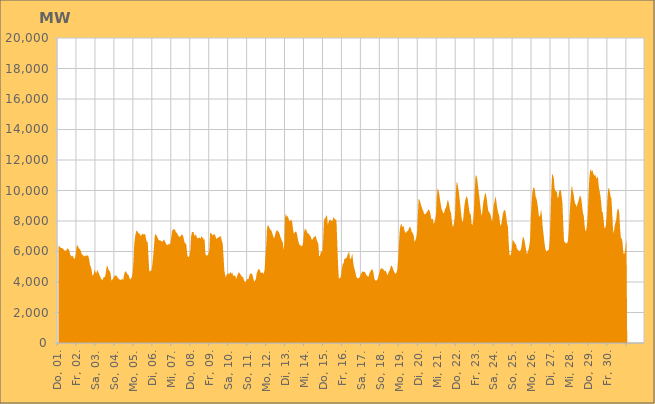
| Category | Series 0 |
|---|---|
|  Do, 01.  | 6313.127 |
|  Do, 01.  | 6357.476 |
|  Do, 01.  | 6304.096 |
|  Do, 01.  | 6225.178 |
|  Do, 01.  | 6220.954 |
|  Do, 01.  | 6224.475 |
|  Do, 01.  | 6151.611 |
|  Do, 01.  | 6129.18 |
|  Do, 01.  | 6037.008 |
|  Do, 01.  | 6063.969 |
|  Do, 01.  | 6048.429 |
|  Do, 01.  | 6220.16 |
|  Do, 01.  | 6166.886 |
|  Do, 01.  | 6145.01 |
|  Do, 01.  | 6027.437 |
|  Do, 01.  | 5776.582 |
|  Do, 01.  | 5723.07 |
|  Fr, 02.  | 5669.2 |
|  Fr, 02.  | 5717.688 |
|  Fr, 02.  | 5616.907 |
|  Fr, 02.  | 5516.828 |
|  Fr, 02.  | 5552.081 |
|  Fr, 02.  | 5806.998 |
|  Fr, 02.  | 6319.606 |
|  Fr, 02.  | 6419.245 |
|  Fr, 02.  | 6318.295 |
|  Fr, 02.  | 6203.759 |
|  Fr, 02.  | 6161.594 |
|  Fr, 02.  | 6093.851 |
|  Fr, 02.  | 5925.767 |
|  Fr, 02.  | 5749.143 |
|  Fr, 02.  | 5816.829 |
|  Fr, 02.  | 5699.738 |
|  Fr, 02.  | 5676.35 |
|  Fr, 02.  | 5717.721 |
|  Fr, 02.  | 5767.764 |
|  Fr, 02.  | 5703.202 |
|  Fr, 02.  | 5749.007 |
|  Fr, 02.  | 5691.561 |
|  Fr, 02.  | 5461.218 |
|  Fr, 02.  | 5111.09 |
|  Sa, 03.  | 5003.085 |
|  Sa, 03.  | 4805.781 |
|  Sa, 03.  | 4424.343 |
|  Sa, 03.  | 4453.459 |
|  Sa, 03.  | 4580.996 |
|  Sa, 03.  | 4837.286 |
|  Sa, 03.  | 4644.824 |
|  Sa, 03.  | 4557.166 |
|  Sa, 03.  | 4787.403 |
|  Sa, 03.  | 4703.969 |
|  Sa, 03.  | 4605.649 |
|  Sa, 03.  | 4450.893 |
|  Sa, 03.  | 4343.789 |
|  Sa, 03.  | 4198.409 |
|  Sa, 03.  | 4162.436 |
|  Sa, 03.  | 4142.401 |
|  Sa, 03.  | 4288.369 |
|  Sa, 03.  | 4323.473 |
|  Sa, 03.  | 4337.465 |
|  Sa, 03.  | 4575.455 |
|  Sa, 03.  | 5003.796 |
|  Sa, 03.  | 5060.668 |
|  Sa, 03.  | 4885.128 |
|  Sa, 03.  | 4746.077 |
|  So, 04.  | 4711.686 |
|  So, 04.  | 4575.496 |
|  So, 04.  | 4092.764 |
|  So, 04.  | 4158.17 |
|  So, 04.  | 4184.512 |
|  So, 04.  | 4307.864 |
|  So, 04.  | 4408.029 |
|  So, 04.  | 4425.54 |
|  So, 04.  | 4421.575 |
|  So, 04.  | 4386.333 |
|  So, 04.  | 4299.27 |
|  So, 04.  | 4227.672 |
|  So, 04.  | 4166.239 |
|  So, 04.  | 4155.13 |
|  So, 04.  | 4118.833 |
|  So, 04.  | 4173.161 |
|  So, 04.  | 4227.237 |
|  So, 04.  | 4099.282 |
|  So, 04.  | 4440.94 |
|  So, 04.  | 4639.087 |
|  So, 04.  | 4703.274 |
|  So, 04.  | 4655.949 |
|  So, 04.  | 4528.27 |
|  So, 04.  | 4486.357 |
|  Mo, 05.  | 4433.787 |
|  Mo, 05.  | 4241.841 |
|  Mo, 05.  | 4167.412 |
|  Mo, 05.  | 4239.905 |
|  Mo, 05.  | 4326.349 |
|  Mo, 05.  | 4640.568 |
|  Mo, 05.  | 5300.942 |
|  Mo, 05.  | 6488.641 |
|  Mo, 05.  | 6940.175 |
|  Mo, 05.  | 7241.371 |
|  Mo, 05.  | 7386.085 |
|  Mo, 05.  | 7327.374 |
|  Mo, 05.  | 7206.397 |
|  Mo, 05.  | 7181.904 |
|  Mo, 05.  | 7166.263 |
|  Mo, 05.  | 7021.53 |
|  Mo, 05.  | 7058.829 |
|  Mo, 05.  | 7152.25 |
|  Mo, 05.  | 7170.063 |
|  Mo, 05.  | 7095.858 |
|  Mo, 05.  | 7149.625 |
|  Mo, 05.  | 7106.2 |
|  Mo, 05.  | 6809.292 |
|  Mo, 05.  | 6620.216 |
|  Di, 06.  | 6630.77 |
|  Di, 06.  | 5673.465 |
|  Di, 06.  | 4703.25 |
|  Di, 06.  | 4703.381 |
|  Di, 06.  | 4749.246 |
|  Di, 06.  | 4806.052 |
|  Di, 06.  | 5182.665 |
|  Di, 06.  | 5678.105 |
|  Di, 06.  | 6341.361 |
|  Di, 06.  | 7026.9 |
|  Di, 06.  | 7154.887 |
|  Di, 06.  | 7064.166 |
|  Di, 06.  | 6958.48 |
|  Di, 06.  | 6863.517 |
|  Di, 06.  | 6739.085 |
|  Di, 06.  | 6724.219 |
|  Di, 06.  | 6751.517 |
|  Di, 06.  | 6652.256 |
|  Di, 06.  | 6698.971 |
|  Di, 06.  | 6631.317 |
|  Di, 06.  | 6783.258 |
|  Di, 06.  | 6759.547 |
|  Di, 06.  | 6641.529 |
|  Di, 06.  | 6546.107 |
|  Mi, 07.  | 6435.412 |
|  Mi, 07.  | 6427.219 |
|  Mi, 07.  | 6445.172 |
|  Mi, 07.  | 6538.629 |
|  Mi, 07.  | 6442.497 |
|  Mi, 07.  | 6596.366 |
|  Mi, 07.  | 6995.698 |
|  Mi, 07.  | 7336.717 |
|  Mi, 07.  | 7456.373 |
|  Mi, 07.  | 7432.278 |
|  Mi, 07.  | 7473.742 |
|  Mi, 07.  | 7362.355 |
|  Mi, 07.  | 7251.961 |
|  Mi, 07.  | 7222.587 |
|  Mi, 07.  | 7117.114 |
|  Mi, 07.  | 7018.814 |
|  Mi, 07.  | 6956.25 |
|  Mi, 07.  | 6995.223 |
|  Mi, 07.  | 7003.775 |
|  Mi, 07.  | 7116.561 |
|  Mi, 07.  | 7087.588 |
|  Mi, 07.  | 7005.832 |
|  Mi, 07.  | 6748.885 |
|  Mi, 07.  | 6560.87 |
|  Do, 08.  | 6534.617 |
|  Do, 08.  | 6449.463 |
|  Do, 08.  | 5844.643 |
|  Do, 08.  | 5630.972 |
|  Do, 08.  | 5657.708 |
|  Do, 08.  | 5741.593 |
|  Do, 08.  | 6057.375 |
|  Do, 08.  | 6983.519 |
|  Do, 08.  | 7270.562 |
|  Do, 08.  | 7284.493 |
|  Do, 08.  | 7286.513 |
|  Do, 08.  | 7049.177 |
|  Do, 08.  | 7034.208 |
|  Do, 08.  | 7140.975 |
|  Do, 08.  | 6951.699 |
|  Do, 08.  | 6875.016 |
|  Do, 08.  | 6863.421 |
|  Do, 08.  | 6897.326 |
|  Do, 08.  | 6923.452 |
|  Do, 08.  | 6834.187 |
|  Do, 08.  | 7027.12 |
|  Do, 08.  | 6873.91 |
|  Do, 08.  | 6947.371 |
|  Do, 08.  | 6761.389 |
|  Fr, 09.  | 6834.662 |
|  Fr, 09.  | 5869.232 |
|  Fr, 09.  | 5748.545 |
|  Fr, 09.  | 5734.458 |
|  Fr, 09.  | 5767.678 |
|  Fr, 09.  | 5872.889 |
|  Fr, 09.  | 6111.792 |
|  Fr, 09.  | 7173.131 |
|  Fr, 09.  | 7229.423 |
|  Fr, 09.  | 7149.998 |
|  Fr, 09.  | 7057.953 |
|  Fr, 09.  | 7082.757 |
|  Fr, 09.  | 7159.592 |
|  Fr, 09.  | 7082.738 |
|  Fr, 09.  | 6978.186 |
|  Fr, 09.  | 6821.046 |
|  Fr, 09.  | 6883.567 |
|  Fr, 09.  | 6882.887 |
|  Fr, 09.  | 6955.09 |
|  Fr, 09.  | 6969.848 |
|  Fr, 09.  | 7019.275 |
|  Fr, 09.  | 6902.404 |
|  Fr, 09.  | 6677.527 |
|  Fr, 09.  | 6525.449 |
|  Sa, 10.  | 5685.53 |
|  Sa, 10.  | 4789.417 |
|  Sa, 10.  | 4465.608 |
|  Sa, 10.  | 4296.912 |
|  Sa, 10.  | 4486.746 |
|  Sa, 10.  | 4534.058 |
|  Sa, 10.  | 4581.499 |
|  Sa, 10.  | 4498.341 |
|  Sa, 10.  | 4607.307 |
|  Sa, 10.  | 4658.383 |
|  Sa, 10.  | 4535.82 |
|  Sa, 10.  | 4610.371 |
|  Sa, 10.  | 4479.933 |
|  Sa, 10.  | 4377.301 |
|  Sa, 10.  | 4431.904 |
|  Sa, 10.  | 4417.656 |
|  Sa, 10.  | 4186.069 |
|  Sa, 10.  | 4339.454 |
|  Sa, 10.  | 4490.166 |
|  Sa, 10.  | 4603.758 |
|  Sa, 10.  | 4639.287 |
|  Sa, 10.  | 4532.868 |
|  Sa, 10.  | 4445.97 |
|  Sa, 10.  | 4385.733 |
|  So, 11.  | 4315.727 |
|  So, 11.  | 4301.465 |
|  So, 11.  | 4077.419 |
|  So, 11.  | 4048.475 |
|  So, 11.  | 3942.382 |
|  So, 11.  | 4122.074 |
|  So, 11.  | 4203.681 |
|  So, 11.  | 4172.451 |
|  So, 11.  | 4242.063 |
|  So, 11.  | 4475.376 |
|  So, 11.  | 4551.462 |
|  So, 11.  | 4551.041 |
|  So, 11.  | 4532.359 |
|  So, 11.  | 4404.868 |
|  So, 11.  | 4163.997 |
|  So, 11.  | 4008.391 |
|  So, 11.  | 4120.289 |
|  So, 11.  | 4201.225 |
|  So, 11.  | 4553.065 |
|  So, 11.  | 4703.255 |
|  So, 11.  | 4817.548 |
|  So, 11.  | 4855.379 |
|  So, 11.  | 4776.482 |
|  So, 11.  | 4613.032 |
|  Mo, 12.  | 4584.554 |
|  Mo, 12.  | 4626.382 |
|  Mo, 12.  | 4596.664 |
|  Mo, 12.  | 4516.47 |
|  Mo, 12.  | 4802.343 |
|  Mo, 12.  | 5651.422 |
|  Mo, 12.  | 6328.447 |
|  Mo, 12.  | 7508.529 |
|  Mo, 12.  | 7719.061 |
|  Mo, 12.  | 7695.031 |
|  Mo, 12.  | 7565.394 |
|  Mo, 12.  | 7439.666 |
|  Mo, 12.  | 7412.619 |
|  Mo, 12.  | 7321.371 |
|  Mo, 12.  | 7151.131 |
|  Mo, 12.  | 6976.116 |
|  Mo, 12.  | 6861.968 |
|  Mo, 12.  | 7010.028 |
|  Mo, 12.  | 7238.367 |
|  Mo, 12.  | 7371.648 |
|  Mo, 12.  | 7392.358 |
|  Mo, 12.  | 7337.577 |
|  Mo, 12.  | 7264.457 |
|  Mo, 12.  | 7151.221 |
|  Di, 13.  | 6958.164 |
|  Di, 13.  | 6846.768 |
|  Di, 13.  | 6683.756 |
|  Di, 13.  | 6636.052 |
|  Di, 13.  | 6090.101 |
|  Di, 13.  | 6573.839 |
|  Di, 13.  | 8223.191 |
|  Di, 13.  | 8484.046 |
|  Di, 13.  | 8289.314 |
|  Di, 13.  | 8333.405 |
|  Di, 13.  | 8205.31 |
|  Di, 13.  | 8069.634 |
|  Di, 13.  | 7965.405 |
|  Di, 13.  | 8050.052 |
|  Di, 13.  | 8079.441 |
|  Di, 13.  | 7910.421 |
|  Di, 13.  | 7455.946 |
|  Di, 13.  | 7163.39 |
|  Di, 13.  | 7244.739 |
|  Di, 13.  | 7301.319 |
|  Di, 13.  | 7314.878 |
|  Di, 13.  | 7153.391 |
|  Di, 13.  | 6843.459 |
|  Di, 13.  | 6614.938 |
|  Mi, 14.  | 6454.183 |
|  Mi, 14.  | 6430.111 |
|  Mi, 14.  | 6342.385 |
|  Mi, 14.  | 6369.514 |
|  Mi, 14.  | 6387.761 |
|  Mi, 14.  | 6714.389 |
|  Mi, 14.  | 7252.609 |
|  Mi, 14.  | 7511.298 |
|  Mi, 14.  | 7430.516 |
|  Mi, 14.  | 7394.299 |
|  Mi, 14.  | 7216.941 |
|  Mi, 14.  | 7194.032 |
|  Mi, 14.  | 7147.29 |
|  Mi, 14.  | 7065.21 |
|  Mi, 14.  | 7018.079 |
|  Mi, 14.  | 6869.069 |
|  Mi, 14.  | 6745.471 |
|  Mi, 14.  | 6831.293 |
|  Mi, 14.  | 6916.863 |
|  Mi, 14.  | 6955.699 |
|  Mi, 14.  | 7032.082 |
|  Mi, 14.  | 6967.101 |
|  Mi, 14.  | 6761.559 |
|  Mi, 14.  | 6622.143 |
|  Do, 15.  | 6507.213 |
|  Do, 15.  | 5719.595 |
|  Do, 15.  | 5687.7 |
|  Do, 15.  | 5917.539 |
|  Do, 15.  | 6007.761 |
|  Do, 15.  | 5977.291 |
|  Do, 15.  | 6570.924 |
|  Do, 15.  | 7984.334 |
|  Do, 15.  | 8166.61 |
|  Do, 15.  | 8185.404 |
|  Do, 15.  | 8330.044 |
|  Do, 15.  | 8383.462 |
|  Do, 15.  | 7730.397 |
|  Do, 15.  | 7930.203 |
|  Do, 15.  | 8044.552 |
|  Do, 15.  | 8104.255 |
|  Do, 15.  | 8042.369 |
|  Do, 15.  | 8005.308 |
|  Do, 15.  | 8001.382 |
|  Do, 15.  | 8262.389 |
|  Do, 15.  | 8177.813 |
|  Do, 15.  | 8122.19 |
|  Do, 15.  | 8072.43 |
|  Do, 15.  | 8016.69 |
|  Fr, 16.  | 6486.733 |
|  Fr, 16.  | 5127.311 |
|  Fr, 16.  | 4224.83 |
|  Fr, 16.  | 4260.872 |
|  Fr, 16.  | 4288.041 |
|  Fr, 16.  | 4518.249 |
|  Fr, 16.  | 4907.443 |
|  Fr, 16.  | 5189.74 |
|  Fr, 16.  | 5232.799 |
|  Fr, 16.  | 5510.299 |
|  Fr, 16.  | 5540.102 |
|  Fr, 16.  | 5559.193 |
|  Fr, 16.  | 5594.735 |
|  Fr, 16.  | 5797.239 |
|  Fr, 16.  | 5883.084 |
|  Fr, 16.  | 6019.737 |
|  Fr, 16.  | 5573.435 |
|  Fr, 16.  | 5477.059 |
|  Fr, 16.  | 5643.973 |
|  Fr, 16.  | 5881.516 |
|  Fr, 16.  | 5356.726 |
|  Fr, 16.  | 5010.366 |
|  Fr, 16.  | 4832.012 |
|  Fr, 16.  | 4610.285 |
|  Sa, 17.  | 4373.749 |
|  Sa, 17.  | 4265.926 |
|  Sa, 17.  | 4235.174 |
|  Sa, 17.  | 4248.568 |
|  Sa, 17.  | 4290.584 |
|  Sa, 17.  | 4381.995 |
|  Sa, 17.  | 4538.223 |
|  Sa, 17.  | 4608.795 |
|  Sa, 17.  | 4704.103 |
|  Sa, 17.  | 4674.569 |
|  Sa, 17.  | 4666.676 |
|  Sa, 17.  | 4653.055 |
|  Sa, 17.  | 4547.321 |
|  Sa, 17.  | 4435.919 |
|  Sa, 17.  | 4405.114 |
|  Sa, 17.  | 4328.903 |
|  Sa, 17.  | 4421.965 |
|  Sa, 17.  | 4605.425 |
|  Sa, 17.  | 4703.136 |
|  Sa, 17.  | 4809.62 |
|  Sa, 17.  | 4816.209 |
|  Sa, 17.  | 4775.699 |
|  Sa, 17.  | 4535.335 |
|  Sa, 17.  | 4217.811 |
|  So, 18.  | 4111.855 |
|  So, 18.  | 4098.547 |
|  So, 18.  | 4110.141 |
|  So, 18.  | 4201.806 |
|  So, 18.  | 4366.338 |
|  So, 18.  | 4598.451 |
|  So, 18.  | 4754.27 |
|  So, 18.  | 4867.352 |
|  So, 18.  | 4912.06 |
|  So, 18.  | 4884.929 |
|  So, 18.  | 4840.465 |
|  So, 18.  | 4787.917 |
|  So, 18.  | 4702.423 |
|  So, 18.  | 4742.207 |
|  So, 18.  | 4664.022 |
|  So, 18.  | 4502.346 |
|  So, 18.  | 4460.955 |
|  So, 18.  | 4659.02 |
|  So, 18.  | 4722.269 |
|  So, 18.  | 4891.623 |
|  So, 18.  | 5078.538 |
|  So, 18.  | 5067.953 |
|  So, 18.  | 4948.451 |
|  So, 18.  | 4783.107 |
|  Mo, 19.  | 4667.928 |
|  Mo, 19.  | 4583.988 |
|  Mo, 19.  | 4529.573 |
|  Mo, 19.  | 4619.144 |
|  Mo, 19.  | 4822.228 |
|  Mo, 19.  | 5442.558 |
|  Mo, 19.  | 6450.341 |
|  Mo, 19.  | 7374.882 |
|  Mo, 19.  | 7700.589 |
|  Mo, 19.  | 7836.127 |
|  Mo, 19.  | 7674.049 |
|  Mo, 19.  | 7593.337 |
|  Mo, 19.  | 7688.953 |
|  Mo, 19.  | 7362.337 |
|  Mo, 19.  | 7262.359 |
|  Mo, 19.  | 7209.567 |
|  Mo, 19.  | 7342.378 |
|  Mo, 19.  | 7323.844 |
|  Mo, 19.  | 7403.657 |
|  Mo, 19.  | 7579.333 |
|  Mo, 19.  | 7594.03 |
|  Mo, 19.  | 7548.22 |
|  Mo, 19.  | 7324.525 |
|  Mo, 19.  | 7255.95 |
|  Di, 20.  | 7150.801 |
|  Di, 20.  | 6989.844 |
|  Di, 20.  | 6600.833 |
|  Di, 20.  | 6760.599 |
|  Di, 20.  | 6920.247 |
|  Di, 20.  | 7299.23 |
|  Di, 20.  | 8454.474 |
|  Di, 20.  | 9455.966 |
|  Di, 20.  | 9385.334 |
|  Di, 20.  | 9247.347 |
|  Di, 20.  | 9041.933 |
|  Di, 20.  | 8878.111 |
|  Di, 20.  | 8748.923 |
|  Di, 20.  | 8640.475 |
|  Di, 20.  | 8427.279 |
|  Di, 20.  | 8469.557 |
|  Di, 20.  | 8454.791 |
|  Di, 20.  | 8555.398 |
|  Di, 20.  | 8624.919 |
|  Di, 20.  | 8723.568 |
|  Di, 20.  | 8763.218 |
|  Di, 20.  | 8635.448 |
|  Di, 20.  | 8435.374 |
|  Di, 20.  | 8113.006 |
|  Mi, 21.  | 8107.764 |
|  Mi, 21.  | 8151.206 |
|  Mi, 21.  | 7813.419 |
|  Mi, 21.  | 7892.748 |
|  Mi, 21.  | 8136.37 |
|  Mi, 21.  | 8428.81 |
|  Mi, 21.  | 9574.07 |
|  Mi, 21.  | 10134.329 |
|  Mi, 21.  | 10025.493 |
|  Mi, 21.  | 9801.416 |
|  Mi, 21.  | 9412.528 |
|  Mi, 21.  | 9095.331 |
|  Mi, 21.  | 8785.278 |
|  Mi, 21.  | 8668.107 |
|  Mi, 21.  | 8544.56 |
|  Mi, 21.  | 8480.412 |
|  Mi, 21.  | 8712.571 |
|  Mi, 21.  | 8834.788 |
|  Mi, 21.  | 8948.587 |
|  Mi, 21.  | 9211.98 |
|  Mi, 21.  | 9394.109 |
|  Mi, 21.  | 9212.962 |
|  Mi, 21.  | 8961.907 |
|  Mi, 21.  | 8630.471 |
|  Do, 22.  | 8539.428 |
|  Do, 22.  | 8011.825 |
|  Do, 22.  | 7629.587 |
|  Do, 22.  | 7690.858 |
|  Do, 22.  | 7944.296 |
|  Do, 22.  | 8404.453 |
|  Do, 22.  | 9829.054 |
|  Do, 22.  | 10527.471 |
|  Do, 22.  | 10506.363 |
|  Do, 22.  | 10183.095 |
|  Do, 22.  | 9842.359 |
|  Do, 22.  | 9378.082 |
|  Do, 22.  | 8875.55 |
|  Do, 22.  | 8350.339 |
|  Do, 22.  | 8007.53 |
|  Do, 22.  | 7916.204 |
|  Do, 22.  | 8462.571 |
|  Do, 22.  | 9042.808 |
|  Do, 22.  | 9346.362 |
|  Do, 22.  | 9546.983 |
|  Do, 22.  | 9624.818 |
|  Do, 22.  | 9447.627 |
|  Do, 22.  | 9071.288 |
|  Do, 22.  | 8679.477 |
|  Fr, 23.  | 8463.835 |
|  Fr, 23.  | 8437.223 |
|  Fr, 23.  | 7798.222 |
|  Fr, 23.  | 7739.685 |
|  Fr, 23.  | 8044.934 |
|  Fr, 23.  | 8754.466 |
|  Fr, 23.  | 9984.997 |
|  Fr, 23.  | 10969.919 |
|  Fr, 23.  | 10983.989 |
|  Fr, 23.  | 10791.097 |
|  Fr, 23.  | 10347.504 |
|  Fr, 23.  | 9903.987 |
|  Fr, 23.  | 9500.706 |
|  Fr, 23.  | 9019.495 |
|  Fr, 23.  | 8547.028 |
|  Fr, 23.  | 8339.285 |
|  Fr, 23.  | 8816.97 |
|  Fr, 23.  | 9317.087 |
|  Fr, 23.  | 9523.773 |
|  Fr, 23.  | 9809.071 |
|  Fr, 23.  | 9820.883 |
|  Fr, 23.  | 9506.727 |
|  Fr, 23.  | 9081.132 |
|  Fr, 23.  | 8691.768 |
|  Sa, 24.  | 8601.996 |
|  Sa, 24.  | 8500.332 |
|  Sa, 24.  | 8421.765 |
|  Sa, 24.  | 8153.784 |
|  Sa, 24.  | 7979.423 |
|  Sa, 24.  | 8402.838 |
|  Sa, 24.  | 9082.651 |
|  Sa, 24.  | 9236.001 |
|  Sa, 24.  | 9639.155 |
|  Sa, 24.  | 9402.595 |
|  Sa, 24.  | 9021.338 |
|  Sa, 24.  | 8706.421 |
|  Sa, 24.  | 8489.769 |
|  Sa, 24.  | 8331.897 |
|  Sa, 24.  | 7836.761 |
|  Sa, 24.  | 7660.698 |
|  Sa, 24.  | 7896.079 |
|  Sa, 24.  | 8265.204 |
|  Sa, 24.  | 8552.966 |
|  Sa, 24.  | 8700.088 |
|  Sa, 24.  | 8726.928 |
|  Sa, 24.  | 8607.297 |
|  Sa, 24.  | 8214.73 |
|  Sa, 24.  | 7810.742 |
|  So, 25.  | 7640.415 |
|  So, 25.  | 6551.565 |
|  So, 25.  | 5747.373 |
|  So, 25.  | 5749.387 |
|  So, 25.  | 5842.889 |
|  So, 25.  | 6265.478 |
|  So, 25.  | 6785.403 |
|  So, 25.  | 6698.477 |
|  So, 25.  | 6629.487 |
|  So, 25.  | 6499.897 |
|  So, 25.  | 6488.566 |
|  So, 25.  | 6287.343 |
|  So, 25.  | 6128.708 |
|  So, 25.  | 6100.879 |
|  So, 25.  | 6031.812 |
|  So, 25.  | 6012.315 |
|  So, 25.  | 6082.442 |
|  So, 25.  | 6265.741 |
|  So, 25.  | 6672.641 |
|  So, 25.  | 6954.087 |
|  So, 25.  | 6913.559 |
|  So, 25.  | 6712.195 |
|  So, 25.  | 6388.786 |
|  So, 25.  | 6111.451 |
|  Mo, 26.  | 5833.893 |
|  Mo, 26.  | 5954.423 |
|  Mo, 26.  | 6115.728 |
|  Mo, 26.  | 6373.725 |
|  Mo, 26.  | 6731.7 |
|  Mo, 26.  | 8229.348 |
|  Mo, 26.  | 9229.218 |
|  Mo, 26.  | 9896.125 |
|  Mo, 26.  | 10141.585 |
|  Mo, 26.  | 10219.428 |
|  Mo, 26.  | 10066.471 |
|  Mo, 26.  | 9615.306 |
|  Mo, 26.  | 9482.347 |
|  Mo, 26.  | 9240.511 |
|  Mo, 26.  | 8900.029 |
|  Mo, 26.  | 8384.548 |
|  Mo, 26.  | 8262.033 |
|  Mo, 26.  | 8425.418 |
|  Mo, 26.  | 8749.651 |
|  Mo, 26.  | 8341.136 |
|  Mo, 26.  | 7614.354 |
|  Mo, 26.  | 7178.365 |
|  Mo, 26.  | 6691.44 |
|  Mo, 26.  | 6287.323 |
|  Di, 27.  | 6077.888 |
|  Di, 27.  | 6002.292 |
|  Di, 27.  | 6063.801 |
|  Di, 27.  | 6076.24 |
|  Di, 27.  | 6201.131 |
|  Di, 27.  | 6830.249 |
|  Di, 27.  | 8425.601 |
|  Di, 27.  | 10092.063 |
|  Di, 27.  | 11116.826 |
|  Di, 27.  | 10990.309 |
|  Di, 27.  | 10834.249 |
|  Di, 27.  | 10162.123 |
|  Di, 27.  | 9988.228 |
|  Di, 27.  | 9936.559 |
|  Di, 27.  | 9906.67 |
|  Di, 27.  | 9478.983 |
|  Di, 27.  | 9596.934 |
|  Di, 27.  | 9969.572 |
|  Di, 27.  | 10037.998 |
|  Di, 27.  | 10011.948 |
|  Di, 27.  | 9628.692 |
|  Di, 27.  | 9182.513 |
|  Di, 27.  | 7857.999 |
|  Di, 27.  | 6689.873 |
|  Mi, 28.  | 6616.708 |
|  Mi, 28.  | 6537.269 |
|  Mi, 28.  | 6544.325 |
|  Mi, 28.  | 6555.359 |
|  Mi, 28.  | 6726.106 |
|  Mi, 28.  | 7331.575 |
|  Mi, 28.  | 8368.648 |
|  Mi, 28.  | 9172.918 |
|  Mi, 28.  | 10010.674 |
|  Mi, 28.  | 10347.268 |
|  Mi, 28.  | 9986.528 |
|  Mi, 28.  | 9810.828 |
|  Mi, 28.  | 9402.336 |
|  Mi, 28.  | 9153.626 |
|  Mi, 28.  | 9069.314 |
|  Mi, 28.  | 8912.875 |
|  Mi, 28.  | 9124.019 |
|  Mi, 28.  | 9250.388 |
|  Mi, 28.  | 9472.429 |
|  Mi, 28.  | 9641.981 |
|  Mi, 28.  | 9629.605 |
|  Mi, 28.  | 9390.98 |
|  Mi, 28.  | 8926.98 |
|  Mi, 28.  | 8504.812 |
|  Do, 29.  | 8353.966 |
|  Do, 29.  | 7751.977 |
|  Do, 29.  | 7350.166 |
|  Do, 29.  | 7373.299 |
|  Do, 29.  | 7737.55 |
|  Do, 29.  | 8383.348 |
|  Do, 29.  | 9684.227 |
|  Do, 29.  | 10788.983 |
|  Do, 29.  | 11277.015 |
|  Do, 29.  | 11404.632 |
|  Do, 29.  | 11214.959 |
|  Do, 29.  | 11363.064 |
|  Do, 29.  | 11084.294 |
|  Do, 29.  | 11029.28 |
|  Do, 29.  | 10971.367 |
|  Do, 29.  | 11001.342 |
|  Do, 29.  | 10746.268 |
|  Do, 29.  | 10902.734 |
|  Do, 29.  | 10836.957 |
|  Do, 29.  | 10274.453 |
|  Do, 29.  | 9963.926 |
|  Do, 29.  | 9688.575 |
|  Do, 29.  | 9232.78 |
|  Do, 29.  | 8622.347 |
|  Fr, 30.  | 8576.705 |
|  Fr, 30.  | 8145.251 |
|  Fr, 30.  | 7570.435 |
|  Fr, 30.  | 7517.51 |
|  Fr, 30.  | 7740.738 |
|  Fr, 30.  | 8338.966 |
|  Fr, 30.  | 9517.14 |
|  Fr, 30.  | 10146.606 |
|  Fr, 30.  | 10156.294 |
|  Fr, 30.  | 9900.001 |
|  Fr, 30.  | 9579.175 |
|  Fr, 30.  | 9496.455 |
|  Fr, 30.  | 8529.384 |
|  Fr, 30.  | 7449.822 |
|  Fr, 30.  | 7187.773 |
|  Fr, 30.  | 7653.608 |
|  Fr, 30.  | 7866.172 |
|  Fr, 30.  | 8064.813 |
|  Fr, 30.  | 8573.538 |
|  Fr, 30.  | 8805.868 |
|  Fr, 30.  | 8795.647 |
|  Fr, 30.  | 8497.953 |
|  Fr, 30.  | 7483.077 |
|  Fr, 30.  | 6875.19 |
|  Sa, 01.  | 6866.159 |
|  Sa, 01.  | 6632.992 |
|  Sa, 01.  | 5938.13 |
|  Sa, 01.  | 5807.709 |
|  Sa, 01.  | 5961.01 |
|  Sa, 01.  | 6347.054 |
|    | 6776.714 |
|    | 0 |
|    | 0 |
|    | 0 |
|    | 0 |
|    | 0 |
|    | 0 |
|    | 0 |
|    | 0 |
|    | 0 |
|    | 0 |
|    | 0 |
|    | 0 |
|    | 0 |
|    | 0 |
|    | 0 |
|    | 0 |
|    | 0 |
|    | 0 |
|    | 0 |
|    | 0 |
|    | 0 |
|    | 0 |
|    | 0 |